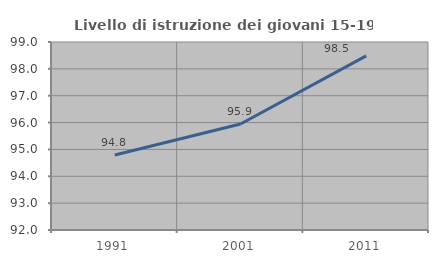
| Category | Livello di istruzione dei giovani 15-19 anni |
|---|---|
| 1991.0 | 94.792 |
| 2001.0 | 95.946 |
| 2011.0 | 98.485 |